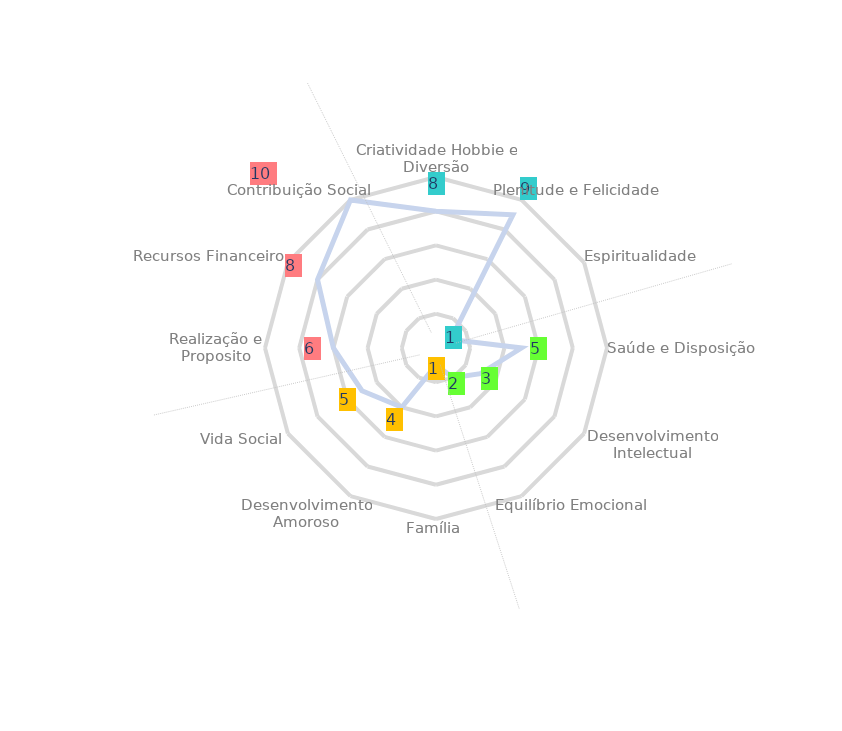
| Category | Series 0 |
|---|---|
| Criatividade Hobbie e Diversão | 8 |
| Plenitude e Felicidade | 9 |
| Espiritualidade | 1 |
| Saúde e Disposição | 5 |
| Desenvolvimento Intelectual | 3 |
| Equilíbrio Emocional | 2 |
| Família | 1 |
| Desenvolvimento Amoroso | 4 |
| Vida Social | 5 |
| Realização e Proposito | 6 |
| Recursos Financeiro | 8 |
| Contribuição Social | 10 |